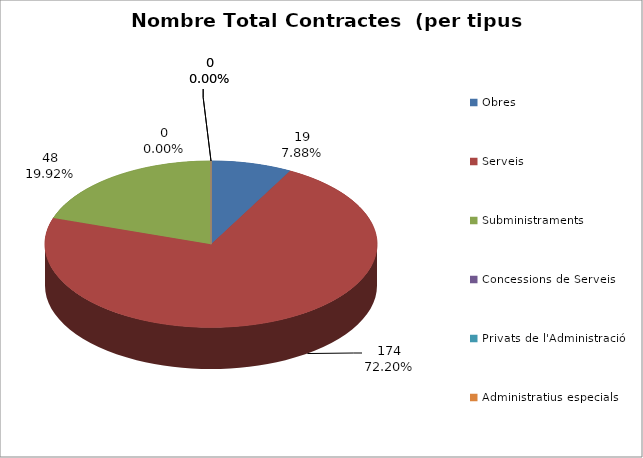
| Category | Nombre Total Contractes |
|---|---|
| Obres | 19 |
| Serveis | 174 |
| Subministraments | 48 |
| Concessions de Serveis | 0 |
| Privats de l'Administració | 0 |
| Administratius especials | 0 |